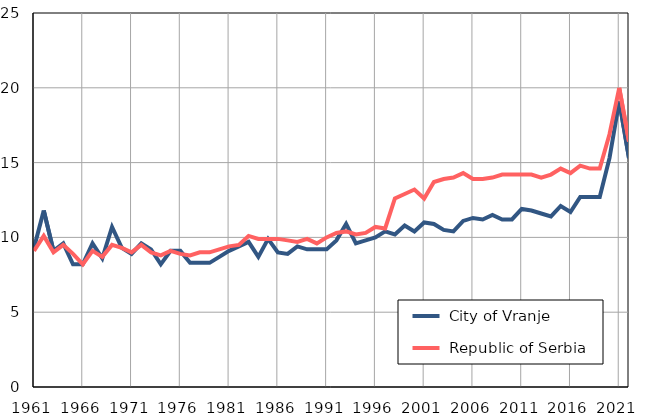
| Category |  City of Vranje |  Republic of Serbia |
|---|---|---|
| 1961.0 | 9.3 | 9.1 |
| 1962.0 | 11.8 | 10.1 |
| 1963.0 | 9.1 | 9 |
| 1964.0 | 9.6 | 9.5 |
| 1965.0 | 8.2 | 8.9 |
| 1966.0 | 8.2 | 8.2 |
| 1967.0 | 9.6 | 9.1 |
| 1968.0 | 8.6 | 8.7 |
| 1969.0 | 10.7 | 9.5 |
| 1970.0 | 9.3 | 9.3 |
| 1971.0 | 8.9 | 9 |
| 1972.0 | 9.6 | 9.5 |
| 1973.0 | 9.2 | 9 |
| 1974.0 | 8.2 | 8.8 |
| 1975.0 | 9.1 | 9.1 |
| 1976.0 | 9.1 | 8.9 |
| 1977.0 | 8.3 | 8.8 |
| 1978.0 | 8.3 | 9 |
| 1979.0 | 8.3 | 9 |
| 1980.0 | 8.7 | 9.2 |
| 1981.0 | 9.1 | 9.4 |
| 1982.0 | 9.4 | 9.5 |
| 1983.0 | 9.7 | 10.1 |
| 1984.0 | 8.7 | 9.9 |
| 1985.0 | 9.9 | 9.9 |
| 1986.0 | 9 | 9.9 |
| 1987.0 | 8.9 | 9.8 |
| 1988.0 | 9.4 | 9.7 |
| 1989.0 | 9.2 | 9.9 |
| 1990.0 | 9.2 | 9.6 |
| 1991.0 | 9.2 | 10 |
| 1992.0 | 9.8 | 10.3 |
| 1993.0 | 10.9 | 10.4 |
| 1994.0 | 9.6 | 10.2 |
| 1995.0 | 9.8 | 10.3 |
| 1996.0 | 10 | 10.7 |
| 1997.0 | 10.4 | 10.6 |
| 1998.0 | 10.2 | 12.6 |
| 1999.0 | 10.8 | 12.9 |
| 2000.0 | 10.4 | 13.2 |
| 2001.0 | 11 | 12.6 |
| 2002.0 | 10.9 | 13.7 |
| 2003.0 | 10.5 | 13.9 |
| 2004.0 | 10.4 | 14 |
| 2005.0 | 11.1 | 14.3 |
| 2006.0 | 11.3 | 13.9 |
| 2007.0 | 11.2 | 13.9 |
| 2008.0 | 11.5 | 14 |
| 2009.0 | 11.2 | 14.2 |
| 2010.0 | 11.2 | 14.2 |
| 2011.0 | 11.9 | 14.2 |
| 2012.0 | 11.8 | 14.2 |
| 2013.0 | 11.6 | 14 |
| 2014.0 | 11.4 | 14.2 |
| 2015.0 | 12.1 | 14.6 |
| 2016.0 | 11.7 | 14.3 |
| 2017.0 | 12.7 | 14.8 |
| 2018.0 | 12.7 | 14.6 |
| 2019.0 | 12.7 | 14.6 |
| 2020.0 | 15.3 | 16.9 |
| 2021.0 | 19.1 | 20 |
| 2022.0 | 15.3 | 16.4 |